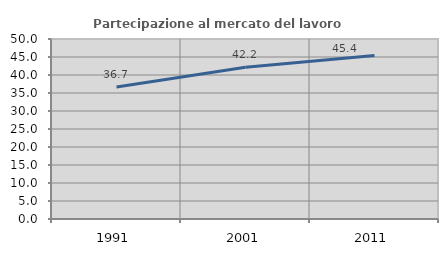
| Category | Partecipazione al mercato del lavoro  femminile |
|---|---|
| 1991.0 | 36.668 |
| 2001.0 | 42.167 |
| 2011.0 | 45.437 |